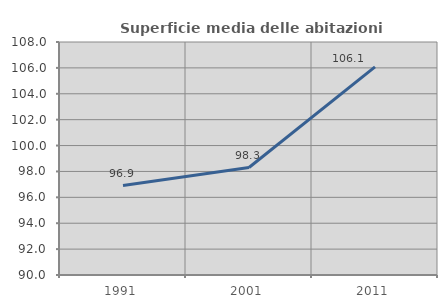
| Category | Superficie media delle abitazioni occupate |
|---|---|
| 1991.0 | 96.907 |
| 2001.0 | 98.303 |
| 2011.0 | 106.083 |